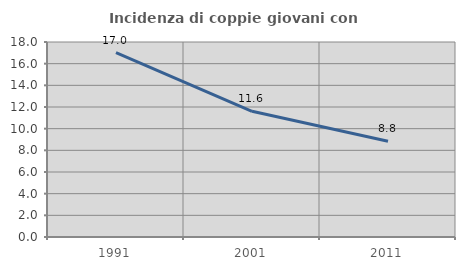
| Category | Incidenza di coppie giovani con figli |
|---|---|
| 1991.0 | 17.009 |
| 2001.0 | 11.607 |
| 2011.0 | 8.84 |